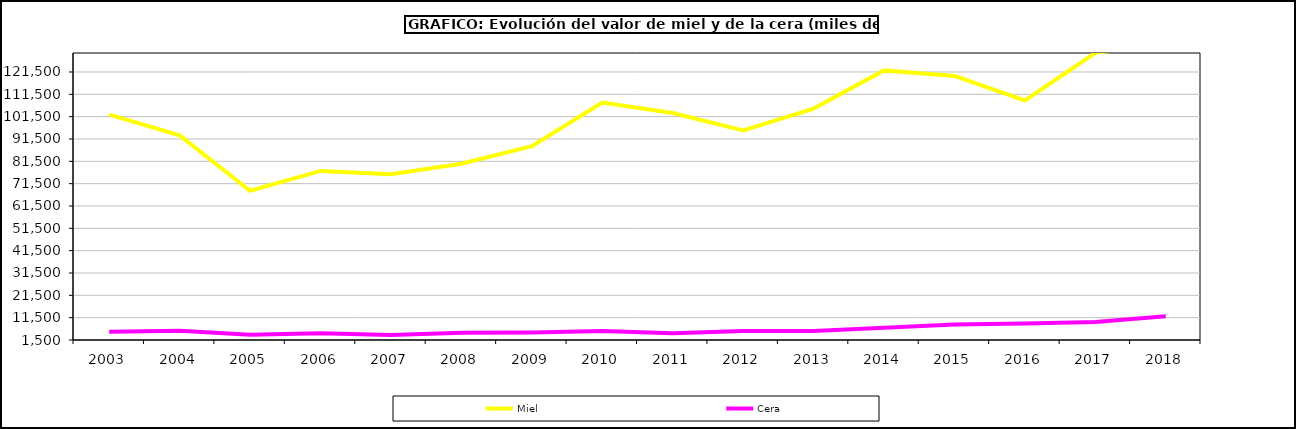
| Category | Miel | Cera |
|---|---|---|
| 2003.0 | 102378.509 | 5174.836 |
| 2004.0 | 93106.002 | 5610.186 |
| 2005.0 | 68333.193 | 3903.341 |
| 2006.0 | 77210.535 | 4545.79 |
| 2007.0 | 75671.047 | 3782.043 |
| 2008.0 | 80408.918 | 4776.982 |
| 2009.0 | 88291.438 | 4877.522 |
| 2010.0 | 107827.095 | 5514.256 |
| 2011.0 | 103137.845 | 4533.385 |
| 2012.0 | 95366.296 | 5543.637 |
| 2013.0 | 105102.791 | 5553.321 |
| 2014.0 | 122217.175 | 7026.714 |
| 2015.0 | 119753.033 | 8392.273 |
| 2016.0 | 108750.281 | 8900.258 |
| 2017.0 | 130055.688 | 9514.815 |
| 2018.0 | 133889.869 | 12109.137 |